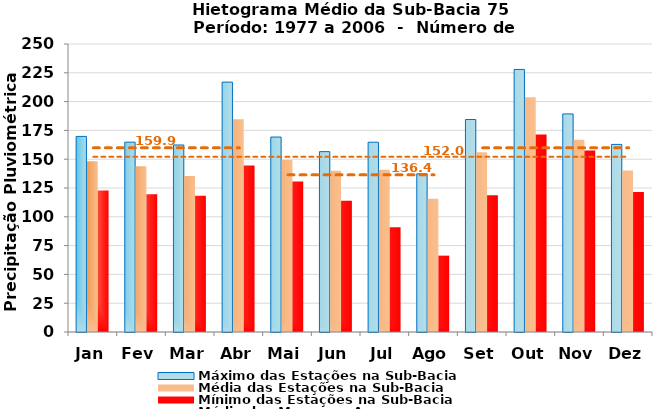
| Category | Máximo das Estações na Sub-Bacia | Média das Estações na Sub-Bacia | Mínimo das Estações na Sub-Bacia |
|---|---|---|---|
| Jan | 169.781 | 148.137 | 122.813 |
| Fev | 164.793 | 143.84 | 119.573 |
| Mar | 162.36 | 135.427 | 118.264 |
| Abr | 216.917 | 184.692 | 144.617 |
| Mai | 169.232 | 149.225 | 130.74 |
| Jun | 156.564 | 140.001 | 114.014 |
| Jul | 164.745 | 140.745 | 90.834 |
| Ago | 137.31 | 115.65 | 66.286 |
| Set | 184.466 | 156.019 | 118.724 |
| Out | 227.903 | 203.836 | 171.37 |
| Nov | 189.307 | 166.842 | 157.477 |
| Dez | 162.833 | 140.178 | 121.5 |